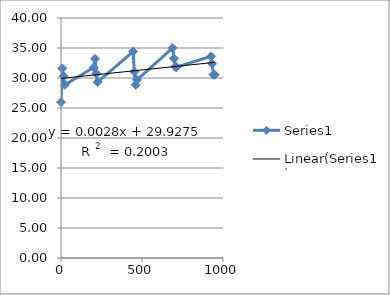
| Category | Series 0 |
|---|---|
| 0.0 | 25.984 |
| 8.0 | 31.608 |
| 16.0 | 30.311 |
| 24.0 | 28.857 |
| 202.0 | 31.764 |
| 210.0 | 33.203 |
| 218.0 | 30.742 |
| 226.0 | 29.321 |
| 445.0 | 34.41 |
| 453.0 | 31.041 |
| 461.0 | 28.856 |
| 469.0 | 29.69 |
| 689.0 | 35.012 |
| 697.0 | 33.247 |
| 705.0 | 31.851 |
| 713.0 | 31.827 |
| 925.0 | 33.591 |
| 933.0 | 32.39 |
| 941.0 | 30.549 |
| 949.0 | 30.546 |